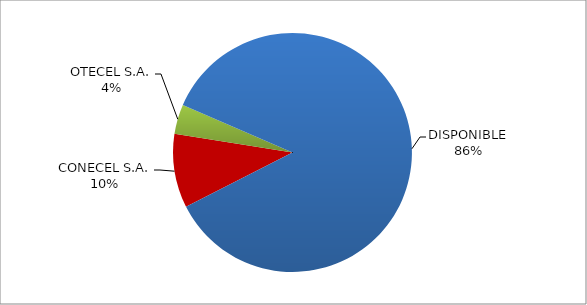
| Category | CÓDIGO DE RED 95 |
|---|---|
| CONECEL S.A. | 0.1 |
| OTECEL S.A. | 0.04 |
| DISPONIBLE | 0.86 |